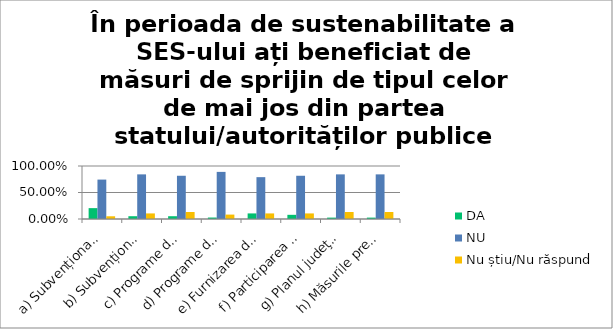
| Category | DA | NU | Nu știu/Nu răspund |
|---|---|---|---|
| a) Subvenționarea locurilor de muncă/ cheltuielilor cu forța de muncă în cadrul SES - Legea 76/2002 | 0.205 | 0.744 | 0.051 |
| b) Subvenționarea serviciilor sociale furnizate grupurilor vulnerabile angajate în SES | 0.053 | 0.842 | 0.105 |
| c) Programe de finanțare/ajutor de stat destinate SES-urilor din fonduri naționale | 0.053 | 0.816 | 0.132 |
| d) Programe de finanțare/ajutor de stat destinate întreprinderilor de economie socială din fonduri naționale | 0.028 | 0.889 | 0.083 |
| e) Furnizarea de servicii /produse către autorități publice – participarea le proceduri de achiziții publice | 0.105 | 0.79 | 0.105 |
| f) Participarea la proceduri de achiziții publice speciale – clauze sociale, contracte rezervate | 0.079 | 0.816 | 0.105 |
| g) Planul judeţean de inserţie socioprofesională | 0.026 | 0.842 | 0.132 |
| h) Măsurile prevăzute pentru unitățile protejate autorizate în baza Legii 448 privind protecția și promovarea drepturilor persoanelor cu dizabilități | 0.026 | 0.842 | 0.132 |